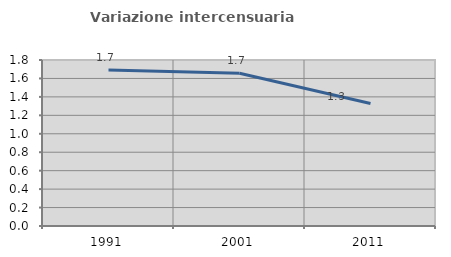
| Category | Variazione intercensuaria annua |
|---|---|
| 1991.0 | 1.692 |
| 2001.0 | 1.656 |
| 2011.0 | 1.329 |